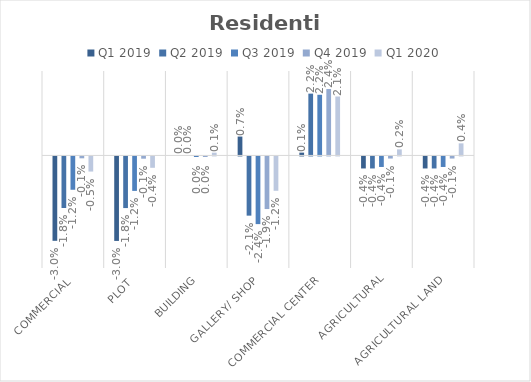
| Category | Q1 2019 | Q2 2019 | Q3 2019 | Q4 2019 | Q1 2020 |
|---|---|---|---|---|---|
| Commercial | -0.03 | -0.018 | -0.012 | -0.001 | -0.005 |
| Plot | -0.03 | -0.018 | -0.012 | -0.001 | -0.004 |
| Building | 0 | 0 | 0 | 0 | 0.001 |
| Gallery/ Shop | 0.007 | -0.021 | -0.024 | -0.019 | -0.012 |
| Commercial Center | 0.001 | 0.022 | 0.022 | 0.024 | 0.021 |
| Agricultural | -0.004 | -0.004 | -0.004 | -0.001 | 0.002 |
| Agricultural Land | -0.004 | -0.004 | -0.004 | -0.001 | 0.004 |